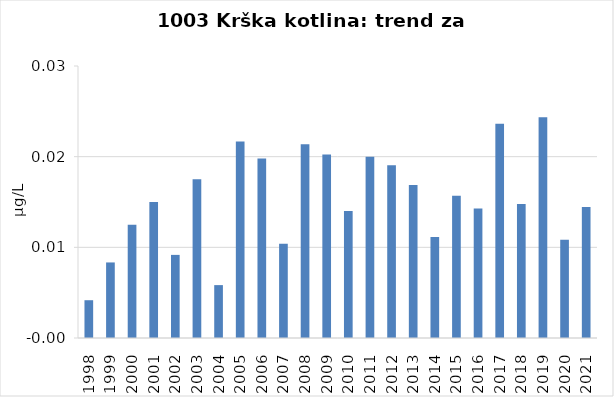
| Category | Vsota |
|---|---|
| 1998 | 0.004 |
| 1999 | 0.008 |
| 2000 | 0.013 |
| 2001 | 0.015 |
| 2002 | 0.009 |
| 2003 | 0.017 |
| 2004 | 0.006 |
| 2005 | 0.022 |
| 2006 | 0.02 |
| 2007 | 0.01 |
| 2008 | 0.021 |
| 2009 | 0.02 |
| 2010 | 0.014 |
| 2011 | 0.02 |
| 2012 | 0.019 |
| 2013 | 0.017 |
| 2014 | 0.011 |
| 2015 | 0.016 |
| 2016 | 0.014 |
| 2017 | 0.024 |
| 2018 | 0.015 |
| 2019 | 0.024 |
| 2020 | 0.011 |
| 2021 | 0.014 |